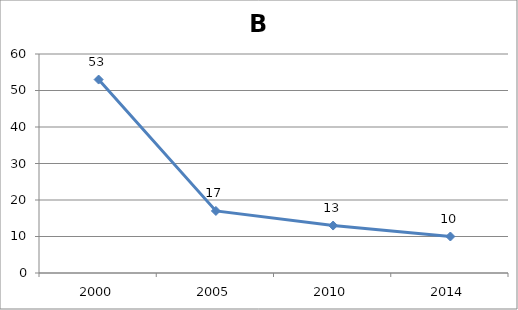
| Category | No of districts with prev>1/10000 |
|---|---|
| 2000.0 | 53 |
| 2005.0 | 17 |
| 2010.0 | 13 |
| 2014.0 | 10 |